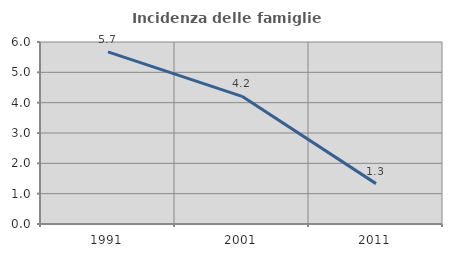
| Category | Incidenza delle famiglie numerose |
|---|---|
| 1991.0 | 5.672 |
| 2001.0 | 4.208 |
| 2011.0 | 1.331 |